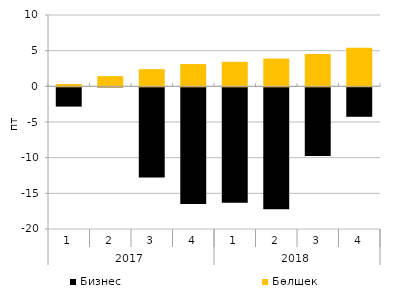
| Category | Бизнес | Бөлшек  |
|---|---|---|
| 0 | -2.699 | 0.323 |
| 1 | -0.005 | 1.427 |
| 2 | -12.657 | 2.409 |
| 3 | -16.343 | 3.119 |
| 4 | -16.169 | 3.434 |
| 5 | -17.094 | 3.889 |
| 6 | -9.631 | 4.532 |
| 7 | -4.127 | 5.395 |